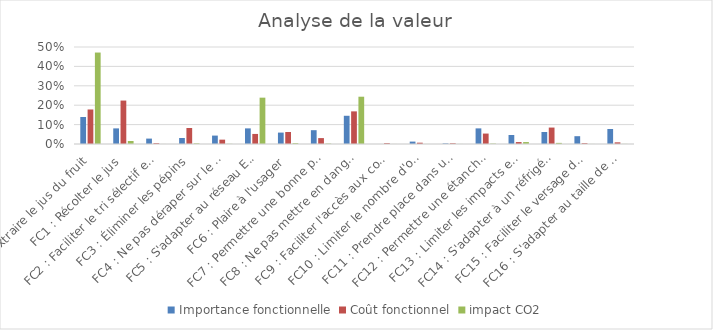
| Category | Importance fonctionnelle | Coût fonctionnel | impact CO2 |
|---|---|---|---|
| FP1 : Extraire le jus du fruit | 0.139 | 0.178 | 0.471 |
| FC1 : Récolter le jus | 0.08 | 0.224 | 0.016 |
| FC2 : Faciliter le tri sélectif en fin de vie | 0.028 | 0.004 | 0 |
| FC3 : Éliminer les pépins | 0.031 | 0.082 | 0.003 |
| FC4 : Ne pas déraper sur le plan de travail | 0.043 | 0.022 | 0.001 |
| FC5 : S'adapter au réseau EDF | 0.08 | 0.052 | 0.239 |
| FC6 : Plaire à l'usager | 0.059 | 0.062 | 0.004 |
| FC7 : Permettre une bonne préhension | 0.071 | 0.03 | 0.002 |
| FC8 : Ne pas mettre en danger l'usager | 0.146 | 0.168 | 0.244 |
| FC9 : Faciliter l'accès aux composants à changer | 0 | 0.004 | 0 |
| FC10 : Limiter le nombre d'outils au montage | 0.012 | 0.007 | 0 |
| FC11 : Prendre place dans un emballage en carton | 0.003 | 0.004 | 0 |
| FC12 : Permettre une étanchéité suffisante | 0.08 | 0.054 | 0.002 |
| FC13 : Limiter les impacts environnementaux | 0.046 | 0.01 | 0.01 |
| FC14 : S'adapter à un réfrigérateur classique | 0.062 | 0.085 | 0.006 |
| FC15 : Faciliter le versage du jus | 0.04 | 0.004 | 0 |
| FC16 : S'adapter au taille de fruits orange, pamplemousse, citron | 0.077 | 0.009 | 0 |